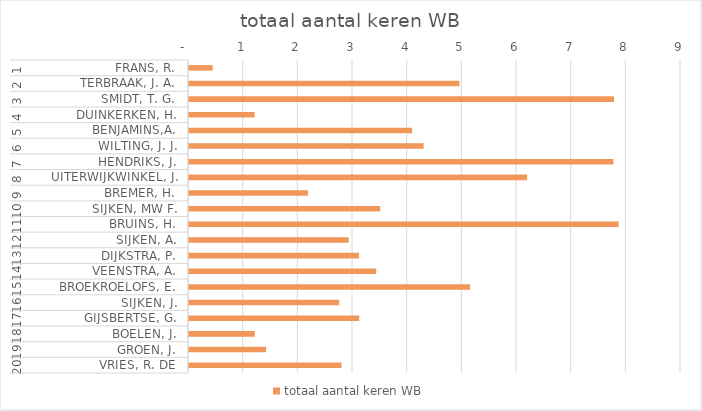
| Category | totaal aantal keren WB |
|---|---|
| 0 | 0.433 |
| 1 | 4.947 |
| 2 | 7.775 |
| 3 | 1.202 |
| 4 | 4.083 |
| 5 | 4.293 |
| 6 | 7.765 |
| 7 | 6.185 |
| 8 | 2.175 |
| 9 | 3.498 |
| 10 | 7.859 |
| 11 | 2.921 |
| 12 | 3.109 |
| 13 | 3.425 |
| 14 | 5.141 |
| 15 | 2.745 |
| 16 | 3.113 |
| 17 | 1.204 |
| 18 | 1.411 |
| 19 | 2.789 |